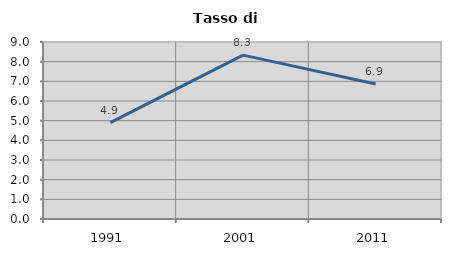
| Category | Tasso di disoccupazione   |
|---|---|
| 1991.0 | 4.899 |
| 2001.0 | 8.333 |
| 2011.0 | 6.863 |